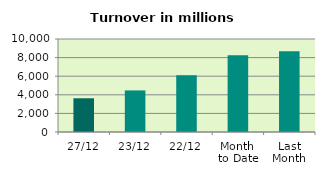
| Category | Series 0 |
|---|---|
| 27/12 | 3625.593 |
| 23/12 | 4471.408 |
| 22/12 | 6099.31 |
| Month 
to Date | 8253.02 |
| Last
Month | 8686.894 |